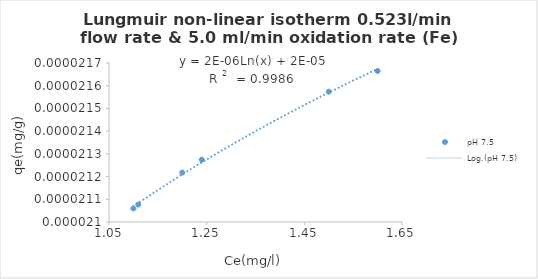
| Category | pH 7.5 |
|---|---|
| 1.6 | 0 |
| 1.5 | 0 |
| 1.24 | 0 |
| 1.2 | 0 |
| 1.1 | 0 |
| 1.11 | 0 |